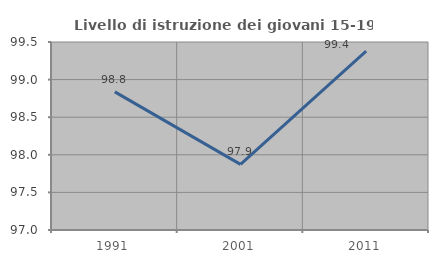
| Category | Livello di istruzione dei giovani 15-19 anni |
|---|---|
| 1991.0 | 98.837 |
| 2001.0 | 97.872 |
| 2011.0 | 99.379 |